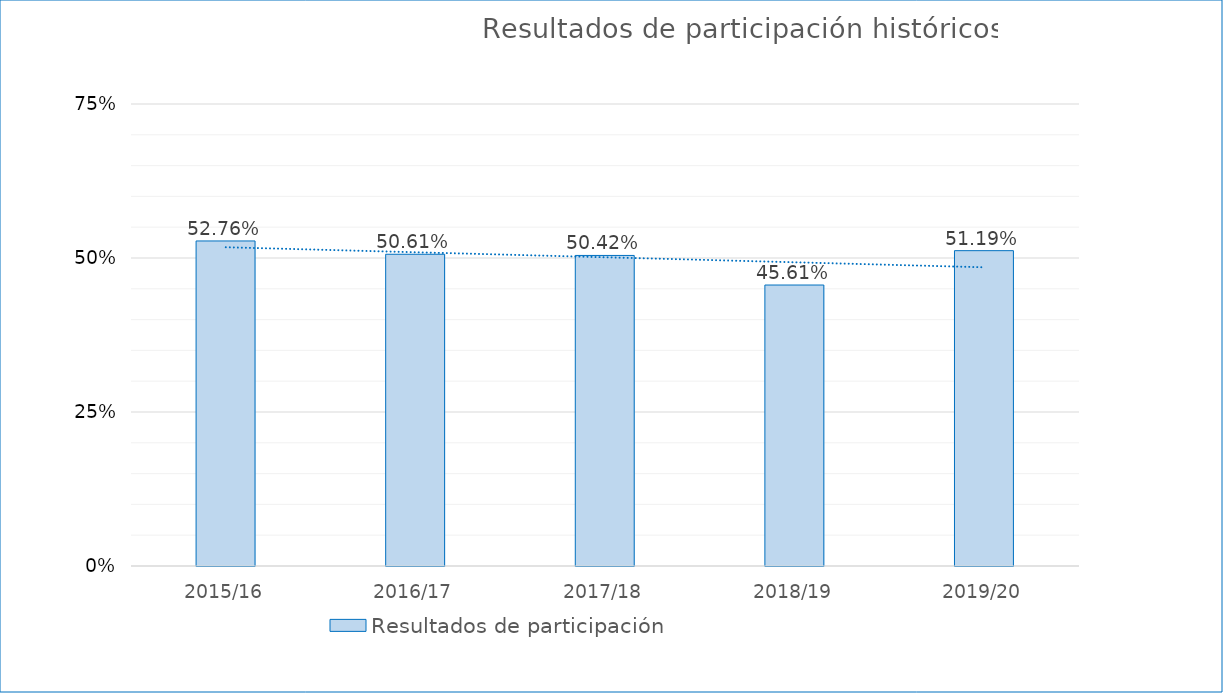
| Category | Resultados de participación |
|---|---|
| 2015/16 | 0.528 |
| 2016/17 | 0.506 |
| 2017/18 | 0.504 |
| 2018/19 | 0.456 |
| 2019/20 | 0.512 |